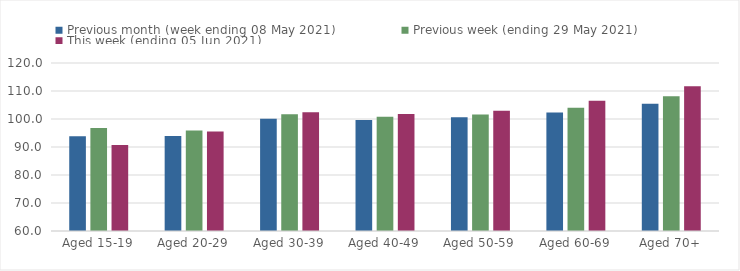
| Category | Previous month (week ending 08 May 2021) | Previous week (ending 29 May 2021) | This week (ending 05 Jun 2021) |
|---|---|---|---|
| Aged 15-19 | 93.85 | 96.81 | 90.7 |
| Aged 20-29 | 93.9 | 95.89 | 95.52 |
| Aged 30-39 | 100.08 | 101.66 | 102.4 |
| Aged 40-49 | 99.63 | 100.8 | 101.81 |
| Aged 50-59 | 100.61 | 101.61 | 102.97 |
| Aged 60-69 | 102.36 | 103.98 | 106.48 |
| Aged 70+ | 105.43 | 108.16 | 111.66 |